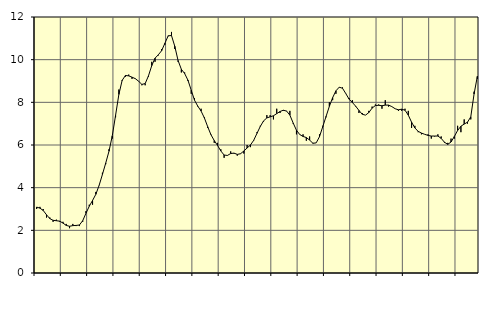
| Category | Piggar | Series 1 |
|---|---|---|
| nan | 3 | 3.09 |
| 87.0 | 3.1 | 3.04 |
| 87.0 | 3 | 2.93 |
| 87.0 | 2.6 | 2.73 |
| nan | 2.6 | 2.55 |
| 88.0 | 2.4 | 2.47 |
| 88.0 | 2.5 | 2.45 |
| 88.0 | 2.4 | 2.43 |
| nan | 2.4 | 2.34 |
| 89.0 | 2.3 | 2.23 |
| 89.0 | 2.1 | 2.19 |
| 89.0 | 2.3 | 2.22 |
| nan | 2.2 | 2.23 |
| 90.0 | 2.2 | 2.25 |
| 90.0 | 2.4 | 2.45 |
| 90.0 | 2.9 | 2.8 |
| nan | 3.2 | 3.13 |
| 91.0 | 3.2 | 3.4 |
| 91.0 | 3.8 | 3.69 |
| 91.0 | 4.1 | 4.11 |
| nan | 4.7 | 4.62 |
| 92.0 | 5.1 | 5.15 |
| 92.0 | 5.8 | 5.71 |
| 92.0 | 6.3 | 6.43 |
| nan | 7.3 | 7.39 |
| 93.0 | 8.6 | 8.37 |
| 93.0 | 9 | 9.03 |
| 93.0 | 9.2 | 9.26 |
| nan | 9.3 | 9.24 |
| 94.0 | 9.1 | 9.18 |
| 94.0 | 9.1 | 9.11 |
| 94.0 | 9 | 8.99 |
| nan | 8.8 | 8.84 |
| 95.0 | 8.8 | 8.88 |
| 95.0 | 9.2 | 9.24 |
| 95.0 | 9.9 | 9.72 |
| nan | 9.9 | 10.07 |
| 96.0 | 10.2 | 10.23 |
| 96.0 | 10.5 | 10.42 |
| 96.0 | 10.7 | 10.77 |
| nan | 11.1 | 11.12 |
| 97.0 | 11.3 | 11.13 |
| 97.0 | 10.5 | 10.63 |
| 97.0 | 9.9 | 9.96 |
| nan | 9.4 | 9.55 |
| 98.0 | 9.4 | 9.35 |
| 98.0 | 9 | 9.04 |
| 98.0 | 8.4 | 8.57 |
| nan | 8.2 | 8.1 |
| 99.0 | 7.8 | 7.82 |
| 99.0 | 7.7 | 7.59 |
| 99.0 | 7.3 | 7.27 |
| nan | 6.8 | 6.86 |
| 0.0 | 6.5 | 6.48 |
| 0.0 | 6.1 | 6.21 |
| 0.0 | 6.1 | 5.98 |
| nan | 5.8 | 5.72 |
| 1.0 | 5.4 | 5.53 |
| 1.0 | 5.5 | 5.51 |
| 1.0 | 5.7 | 5.6 |
| nan | 5.6 | 5.62 |
| 2.0 | 5.5 | 5.56 |
| 2.0 | 5.6 | 5.59 |
| 2.0 | 5.6 | 5.72 |
| nan | 6 | 5.86 |
| 3.0 | 5.9 | 6 |
| 3.0 | 6.2 | 6.22 |
| 3.0 | 6.6 | 6.55 |
| nan | 6.9 | 6.87 |
| 4.0 | 7.1 | 7.13 |
| 4.0 | 7.4 | 7.27 |
| 4.0 | 7.4 | 7.32 |
| nan | 7.2 | 7.37 |
| 5.0 | 7.7 | 7.47 |
| 5.0 | 7.5 | 7.57 |
| 5.0 | 7.6 | 7.63 |
| nan | 7.6 | 7.59 |
| 6.0 | 7.6 | 7.4 |
| 6.0 | 7 | 7.03 |
| 6.0 | 6.5 | 6.69 |
| nan | 6.5 | 6.49 |
| 7.0 | 6.5 | 6.4 |
| 7.0 | 6.2 | 6.35 |
| 7.0 | 6.4 | 6.23 |
| nan | 6.1 | 6.08 |
| 8.0 | 6.1 | 6.1 |
| 8.0 | 6.5 | 6.39 |
| 8.0 | 6.9 | 6.86 |
| nan | 7.3 | 7.34 |
| 9.0 | 8 | 7.81 |
| 9.0 | 8.1 | 8.22 |
| 9.0 | 8.4 | 8.54 |
| nan | 8.7 | 8.71 |
| 10.0 | 8.7 | 8.66 |
| 10.0 | 8.4 | 8.41 |
| 10.0 | 8.2 | 8.15 |
| nan | 8.1 | 7.99 |
| 11.0 | 7.8 | 7.82 |
| 11.0 | 7.5 | 7.62 |
| 11.0 | 7.5 | 7.44 |
| nan | 7.4 | 7.4 |
| 12.0 | 7.6 | 7.52 |
| 12.0 | 7.8 | 7.73 |
| 12.0 | 7.9 | 7.85 |
| nan | 7.9 | 7.86 |
| 13.0 | 7.7 | 7.84 |
| 13.0 | 8.1 | 7.87 |
| 13.0 | 7.8 | 7.87 |
| nan | 7.8 | 7.8 |
| 14.0 | 7.7 | 7.7 |
| 14.0 | 7.6 | 7.65 |
| 14.0 | 7.6 | 7.68 |
| nan | 7.7 | 7.63 |
| 15.0 | 7.6 | 7.4 |
| 15.0 | 6.8 | 7.07 |
| 15.0 | 6.9 | 6.8 |
| nan | 6.6 | 6.64 |
| 16.0 | 6.5 | 6.56 |
| 16.0 | 6.5 | 6.5 |
| 16.0 | 6.5 | 6.45 |
| nan | 6.3 | 6.42 |
| 17.0 | 6.4 | 6.42 |
| 17.0 | 6.5 | 6.42 |
| 17.0 | 6.4 | 6.31 |
| nan | 6.1 | 6.13 |
| 18.0 | 6.1 | 6.03 |
| 18.0 | 6.3 | 6.14 |
| 18.0 | 6.3 | 6.4 |
| nan | 6.9 | 6.68 |
| 19.0 | 6.6 | 6.88 |
| 19.0 | 7.2 | 6.98 |
| 19.0 | 7 | 7.07 |
| nan | 7.2 | 7.32 |
| 20.0 | 8.5 | 8.39 |
| 20.0 | 9.1 | 9.22 |